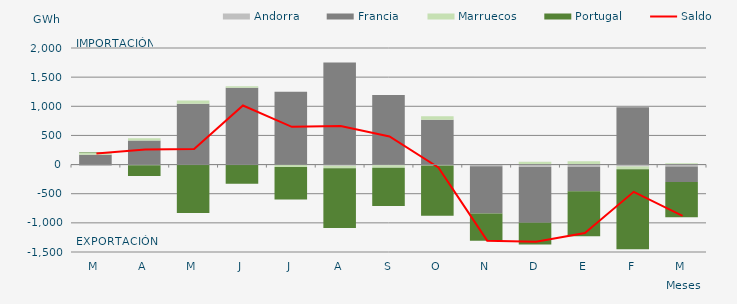
| Category | Andorra | Francia | Marruecos | Portugal |
|---|---|---|---|---|
| M | -22.893 | 167.561 | 36.658 | 8.529 |
| A | -12.109 | 414.006 | 37.615 | -182.942 |
| M | 0 | 1041.564 | 58.27 | -830.783 |
| J | -5.126 | 1319.462 | 23.039 | -324.448 |
| J | -3.551 | 1247.95 | -38.635 | -558.283 |
| A | -19.02 | 1750.608 | -45.265 | -1025.301 |
| S | -11.131 | 1193.426 | -45.19 | -654.794 |
| O | -15.195 | 769.066 | 59.008 | -860.78 |
| N | -28.632 | -809.352 | -1.998 | -465.164 |
| D | -40.654 | -959.109 | 48.514 | -372.253 |
| E | -38.484 | -419.676 | 57.119 | -772.422 |
| F | -34.803 | 984.059 | -44.168 | -1373 |
| M | -31.125 | -269.835 | 22.023 | -601.344 |